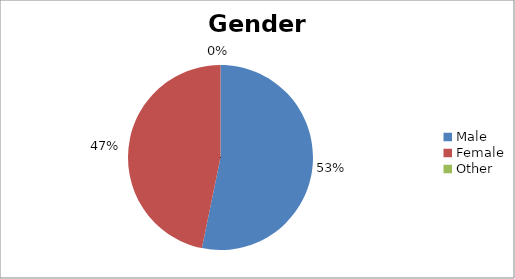
| Category | Gender |
|---|---|
| Male | 33 |
| Female | 29 |
| Other | 0 |